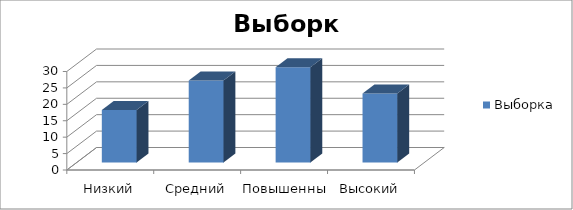
| Category | Выборка |
|---|---|
| Низкий | 16 |
| Средний | 25 |
| Повышенный | 29 |
| Высокий | 21 |